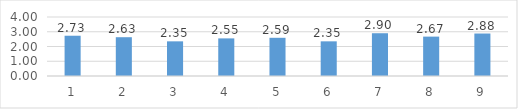
| Category | Series 0 |
|---|---|
| 0 | 2.73 |
| 1 | 2.63 |
| 2 | 2.35 |
| 3 | 2.55 |
| 4 | 2.59 |
| 5 | 2.35 |
| 6 | 2.9 |
| 7 | 2.67 |
| 8 | 2.88 |